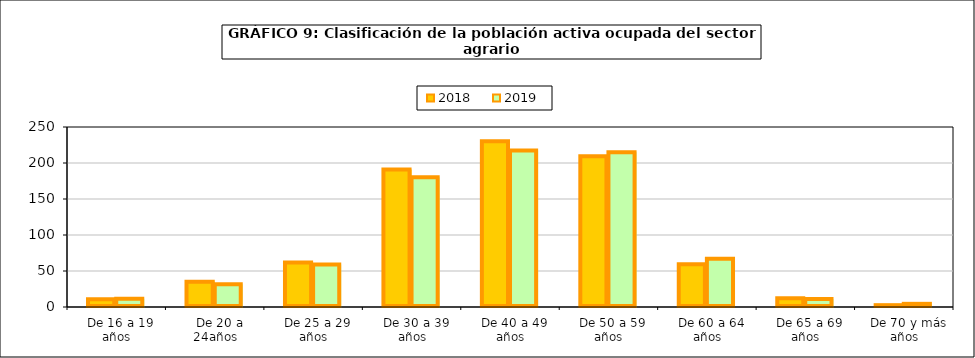
| Category | 2018 | 2019 |
|---|---|---|
|   De 16 a 19 años | 10.725 | 11.525 |
|   De 20 a 24años | 35.2 | 31.6 |
|   De 25 a 29 años | 61.975 | 58.975 |
|   De 30 a 39 años | 191.075 | 180.2 |
|   De 40 a 49 años | 230.2 | 217.275 |
|   De 50 a 59 años | 209.275 | 214.925 |
|   De 60 a 64 años | 59.5 | 67.1 |
|   De 65 a 69 años | 12.1 | 11.25 |
|   De 70 y más años | 2.55 | 4.4 |